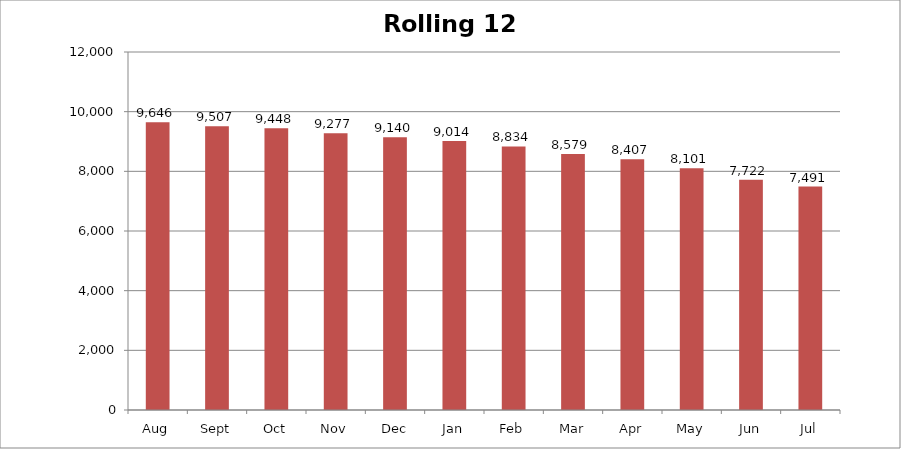
| Category | Rolling 12 Month |
|---|---|
| Aug | 9646 |
| Sept | 9507 |
| Oct | 9448 |
| Nov | 9277 |
| Dec | 9140 |
| Jan | 9014 |
| Feb | 8834 |
| Mar | 8579 |
| Apr | 8407 |
| May | 8101 |
| Jun | 7722 |
| Jul | 7491 |